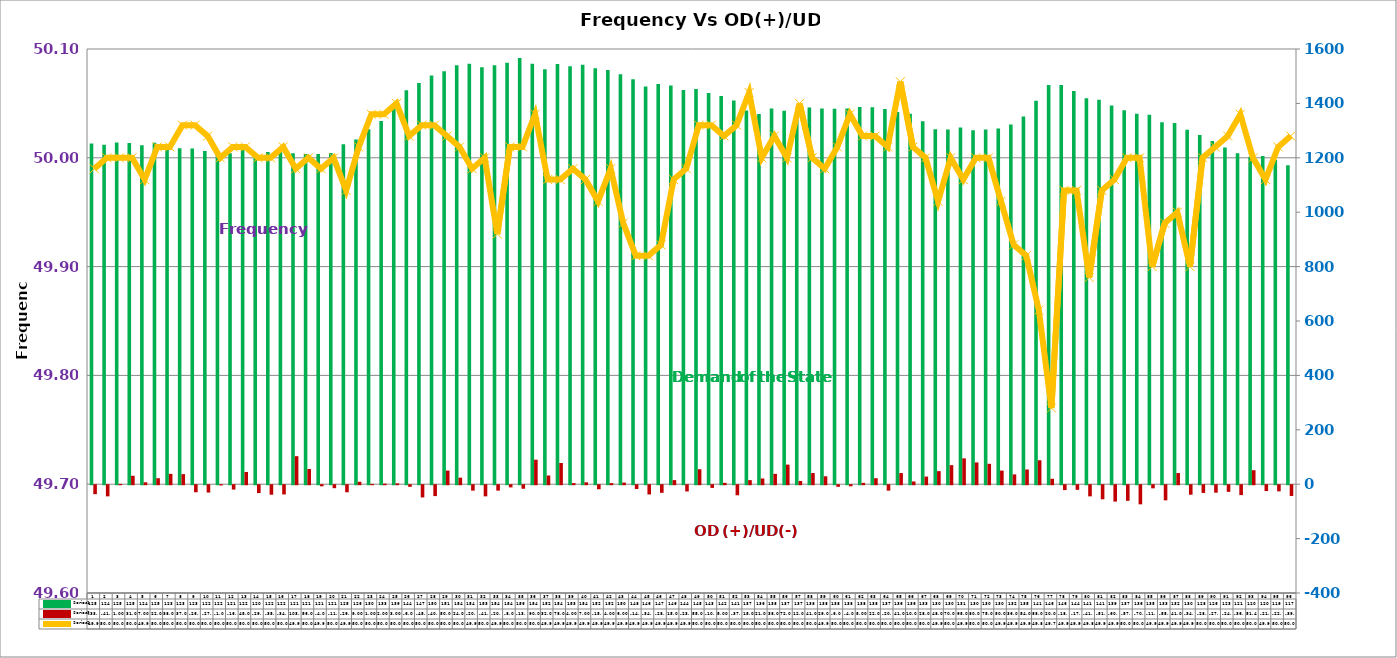
| Category | Series 2 | Series 4 |
|---|---|---|
| 0 | 1253 | -33 |
| 1 | 1248 | -41 |
| 2 | 1256 | 1 |
| 3 | 1254 | 31 |
| 4 | 1246 | 7 |
| 5 | 1255 | 22 |
| 6 | 1238 | 38 |
| 7 | 1235 | 37 |
| 8 | 1234 | -26 |
| 9 | 1225 | -27 |
| 10 | 1225 | -1 |
| 11 | 1217 | -16 |
| 12 | 1229 | 45 |
| 13 | 1208 | -29 |
| 14 | 1221 | -35 |
| 15 | 1222 | -34 |
| 16 | 1217 | 103 |
| 17 | 1214 | 56 |
| 18 | 1214 | -4 |
| 19 | 1218 | -11 |
| 20 | 1250 | -26 |
| 21 | 1267 | 9 |
| 22 | 1305 | 1 |
| 23 | 1335 | 2 |
| 24 | 1395 | 3 |
| 25 | 1448 | -6 |
| 26 | 1475 | -45 |
| 27 | 1503 | -40 |
| 28 | 1518 | 50 |
| 29 | 1540 | 24 |
| 30 | 1546 | -20 |
| 31 | 1533 | -41 |
| 32 | 1540 | -20 |
| 33 | 1549 | -8 |
| 34 | 1567 | -13 |
| 35 | 1546 | 90 |
| 36 | 1526 | 32 |
| 37 | 1545 | 78 |
| 38 | 1537 | 4 |
| 39 | 1542 | 7 |
| 40 | 1529 | -15 |
| 41 | 1523 | 4 |
| 42 | 1507 | 6 |
| 43 | 1489 | -14 |
| 44 | 1462 | -34 |
| 45 | 1471 | -28 |
| 46 | 1466 | 15 |
| 47 | 1449 | -23 |
| 48 | 1453 | 55 |
| 49 | 1438 | -10 |
| 50 | 1427 | 5 |
| 51 | 1411 | -37 |
| 52 | 1374 | 15 |
| 53 | 1361 | 21 |
| 54 | 1381 | 38 |
| 55 | 1373 | 72 |
| 56 | 1370 | 12 |
| 57 | 1385 | 41 |
| 58 | 1381 | 29 |
| 59 | 1380 | -6 |
| 60 | 1381 | -4 |
| 61 | 1387 | 5 |
| 62 | 1386 | 22 |
| 63 | 1379 | -20 |
| 64 | 1368 | 41 |
| 65 | 1362 | 10 |
| 66 | 1334 | 28 |
| 67 | 1305 | 48 |
| 68 | 1304 | 70 |
| 69 | 1311 | 95 |
| 70 | 1301 | 80 |
| 71 | 1304 | 75 |
| 72 | 1308 | 50 |
| 73 | 1322 | 36 |
| 74 | 1352 | 54 |
| 75 | 1410 | 88 |
| 76 | 1468 | 20 |
| 77 | 1468 | -18 |
| 78 | 1446 | -17 |
| 79 | 1419 | -41 |
| 80 | 1413 | -51.794 |
| 81 | 1392 | -60.294 |
| 82 | 1375 | -57.345 |
| 83 | 1362 | -70.318 |
| 84 | 1358 | -11.523 |
| 85 | 1331 | -55.613 |
| 86 | 1328 | 41.008 |
| 87 | 1303 | -34.992 |
| 88 | 1284 | -28.416 |
| 89 | 1262 | -27.416 |
| 90 | 1238 | -24.496 |
| 91 | 1217 | -36.381 |
| 92 | 1204 | 51.417 |
| 93 | 1207 | -21.583 |
| 94 | 1193 | -22.583 |
| 95 | 1173 | -39.583 |